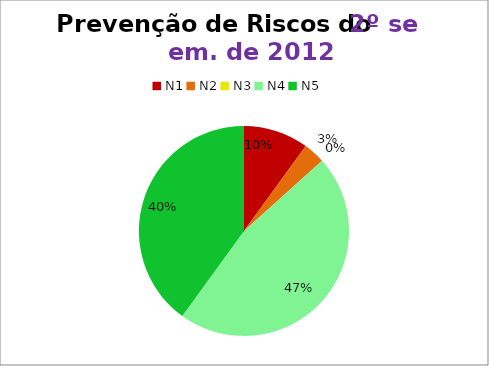
| Category | 2º/12 |
|---|---|
| N1 | 3 |
| N2 | 1 |
| N3 | 0 |
| N4 | 14 |
| N5 | 12 |